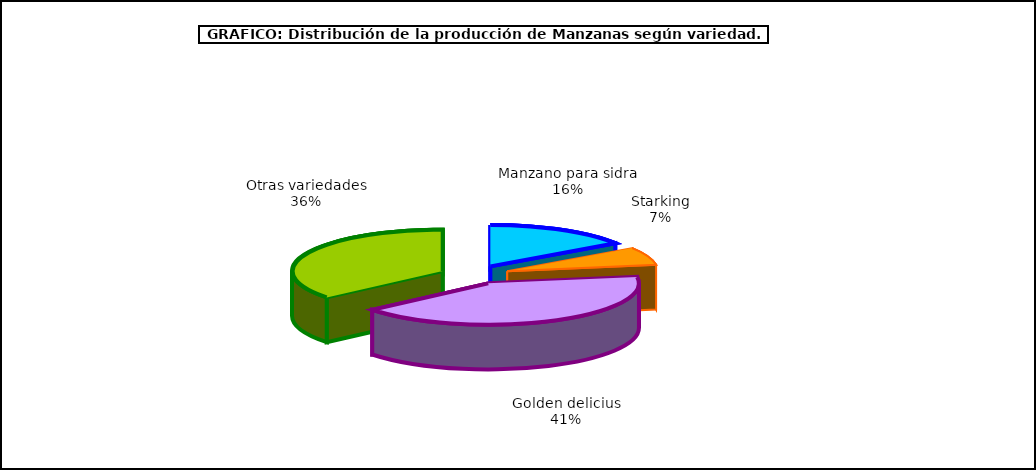
| Category | produccion |
|---|---|
| 0 | 91.292 |
| 1 | 40.899 |
| 2 | 243.387 |
| 3 | 211.456 |